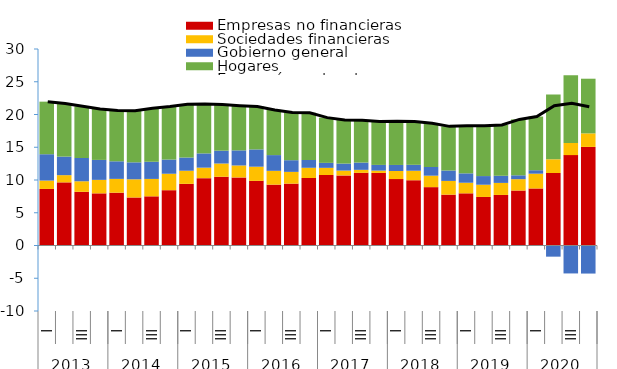
| Category | Empresas no financieras | Sociedades financieras | Gobierno general | Hogares |
|---|---|---|---|---|
| 0 | 8.633 | 1.281 | 4.021 | 8.026 |
| 1 | 9.639 | 1.102 | 2.834 | 8.088 |
| 2 | 8.194 | 1.612 | 3.551 | 7.899 |
| 3 | 7.962 | 2.059 | 3.046 | 7.77 |
| 4 | 8.063 | 2.107 | 2.684 | 7.756 |
| 5 | 7.331 | 2.777 | 2.588 | 7.868 |
| 6 | 7.507 | 2.657 | 2.621 | 8.166 |
| 7 | 8.443 | 2.511 | 2.166 | 8.096 |
| 8 | 9.412 | 2.003 | 2.018 | 8.13 |
| 9 | 10.285 | 1.601 | 2.176 | 7.561 |
| 10 | 10.497 | 2.02 | 1.96 | 7.047 |
| 11 | 10.397 | 1.821 | 2.305 | 6.827 |
| 12 | 9.869 | 2.163 | 2.637 | 6.551 |
| 13 | 9.293 | 2.106 | 2.403 | 6.9 |
| 14 | 9.447 | 1.792 | 1.783 | 7.282 |
| 15 | 10.307 | 1.558 | 1.188 | 7.209 |
| 16 | 10.766 | 1.091 | 0.759 | 6.906 |
| 17 | 10.702 | 0.736 | 1.069 | 6.661 |
| 18 | 11.096 | 0.455 | 1.112 | 6.447 |
| 19 | 11.076 | 0.36 | 0.868 | 6.614 |
| 20 | 10.139 | 1.239 | 0.92 | 6.69 |
| 21 | 9.966 | 1.446 | 0.906 | 6.594 |
| 22 | 8.91 | 1.75 | 1.321 | 6.669 |
| 23 | 7.767 | 2.093 | 1.588 | 6.741 |
| 24 | 7.966 | 1.616 | 1.434 | 7.276 |
| 25 | 7.411 | 1.868 | 1.321 | 7.668 |
| 26 | 7.719 | 1.837 | 1.089 | 7.754 |
| 27 | 8.393 | 1.733 | 0.59 | 8.537 |
| 28 | 8.708 | 2.258 | 0.528 | 8.193 |
| 29 | 11.072 | 2.09 | -1.704 | 9.883 |
| 30 | 13.8 | 1.855 | -4.266 | 10.32 |
| 31 | 15.05 | 2.068 | -4.285 | 8.346 |